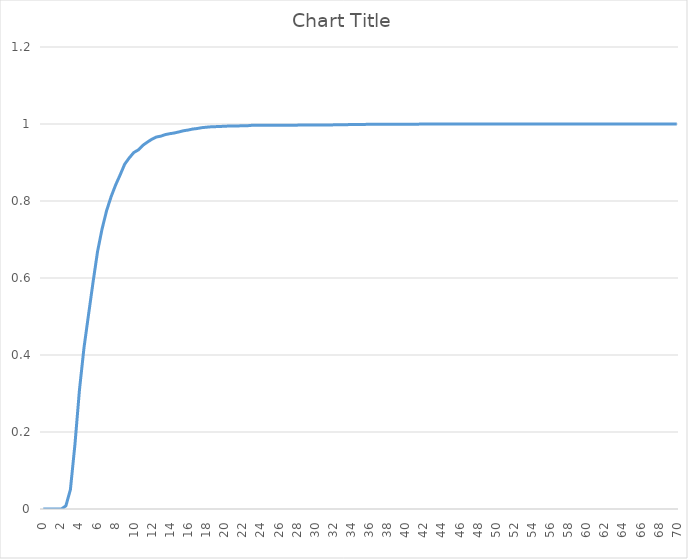
| Category | Series 0 |
|---|---|
| 0.0 | 0 |
| 0.5 | 0 |
| 1.0 | 0 |
| 1.5 | 0 |
| 2.0 | 0 |
| 2.5 | 0.008 |
| 3.0 | 0.05 |
| 3.5 | 0.167 |
| 4.0 | 0.309 |
| 4.5 | 0.419 |
| 5.0 | 0.504 |
| 5.5 | 0.589 |
| 6.0 | 0.669 |
| 6.5 | 0.727 |
| 7.0 | 0.775 |
| 7.5 | 0.811 |
| 8.0 | 0.842 |
| 8.5 | 0.868 |
| 9.0 | 0.896 |
| 9.5 | 0.912 |
| 10.0 | 0.926 |
| 10.5 | 0.933 |
| 11.0 | 0.945 |
| 11.5 | 0.953 |
| 12.0 | 0.96 |
| 12.5 | 0.966 |
| 13.0 | 0.968 |
| 13.5 | 0.973 |
| 14.0 | 0.975 |
| 14.5 | 0.977 |
| 15.0 | 0.979 |
| 15.5 | 0.982 |
| 16.0 | 0.984 |
| 16.5 | 0.987 |
| 17.0 | 0.988 |
| 17.5 | 0.99 |
| 18.0 | 0.992 |
| 18.5 | 0.993 |
| 19.0 | 0.993 |
| 19.5 | 0.993 |
| 20.0 | 0.994 |
| 20.5 | 0.995 |
| 21.0 | 0.995 |
| 21.5 | 0.995 |
| 22.0 | 0.995 |
| 22.5 | 0.995 |
| 23.0 | 0.996 |
| 23.5 | 0.996 |
| 24.0 | 0.996 |
| 24.5 | 0.996 |
| 25.0 | 0.997 |
| 25.5 | 0.997 |
| 26.0 | 0.997 |
| 26.5 | 0.997 |
| 27.0 | 0.997 |
| 27.5 | 0.997 |
| 28.0 | 0.997 |
| 28.5 | 0.997 |
| 29.0 | 0.997 |
| 29.5 | 0.997 |
| 30.0 | 0.997 |
| 30.5 | 0.998 |
| 31.0 | 0.998 |
| 31.5 | 0.998 |
| 32.0 | 0.998 |
| 32.5 | 0.998 |
| 33.0 | 0.998 |
| 33.5 | 0.998 |
| 34.0 | 0.999 |
| 34.5 | 0.999 |
| 35.0 | 0.999 |
| 35.5 | 0.999 |
| 36.0 | 0.999 |
| 36.5 | 0.999 |
| 37.0 | 0.999 |
| 37.5 | 1 |
| 38.0 | 1 |
| 38.5 | 1 |
| 39.0 | 1 |
| 39.5 | 1 |
| 40.0 | 1 |
| 40.5 | 1 |
| 41.0 | 1 |
| 41.5 | 1 |
| 42.0 | 1 |
| 42.5 | 1 |
| 43.0 | 1 |
| 43.5 | 1 |
| 44.0 | 1 |
| 44.5 | 1 |
| 45.0 | 1 |
| 45.5 | 1 |
| 46.0 | 1 |
| 46.5 | 1 |
| 47.0 | 1 |
| 47.5 | 1 |
| 48.0 | 1 |
| 48.5 | 1 |
| 49.0 | 1 |
| 49.5 | 1 |
| 50.0 | 1 |
| 50.5 | 1 |
| 51.0 | 1 |
| 51.5 | 1 |
| 52.0 | 1 |
| 52.5 | 1 |
| 53.0 | 1 |
| 53.5 | 1 |
| 54.0 | 1 |
| 54.5 | 1 |
| 55.0 | 1 |
| 55.5 | 1 |
| 56.0 | 1 |
| 56.5 | 1 |
| 57.0 | 1 |
| 57.5 | 1 |
| 58.0 | 1 |
| 58.5 | 1 |
| 59.0 | 1 |
| 59.5 | 1 |
| 60.0 | 1 |
| 60.5 | 1 |
| 61.0 | 1 |
| 61.5 | 1 |
| 62.0 | 1 |
| 62.5 | 1 |
| 63.0 | 1 |
| 63.5 | 1 |
| 64.0 | 1 |
| 64.5 | 1 |
| 65.0 | 1 |
| 65.5 | 1 |
| 66.0 | 1 |
| 66.5 | 1 |
| 67.0 | 1 |
| 67.5 | 1 |
| 68.0 | 1 |
| 68.5 | 1 |
| 69.0 | 1 |
| 69.5 | 1 |
| 70.0 | 1 |